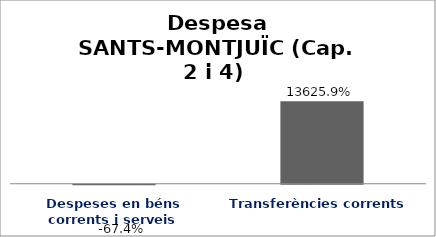
| Category | Series 0 |
|---|---|
| Despeses en béns corrents i serveis | -0.674 |
| Transferències corrents | 136.259 |